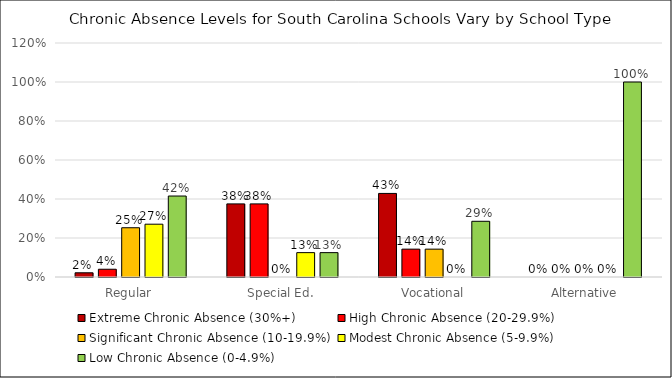
| Category | Extreme Chronic Absence (30%+) | High Chronic Absence (20-29.9%) | Significant Chronic Absence (10-19.9%) | Modest Chronic Absence (5-9.9%) | Low Chronic Absence (0-4.9%) |
|---|---|---|---|---|---|
| Regular | 0.022 | 0.04 | 0.253 | 0.271 | 0.415 |
| Special Ed. | 0.375 | 0.375 | 0 | 0.125 | 0.125 |
| Vocational | 0.429 | 0.143 | 0.143 | 0 | 0.286 |
| Alternative | 0 | 0 | 0 | 0 | 1 |